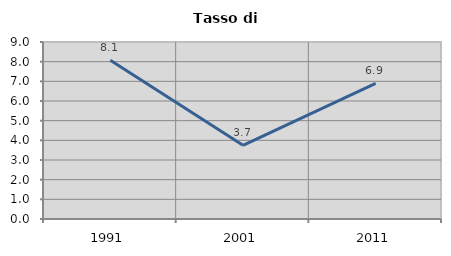
| Category | Tasso di disoccupazione   |
|---|---|
| 1991.0 | 8.073 |
| 2001.0 | 3.745 |
| 2011.0 | 6.895 |